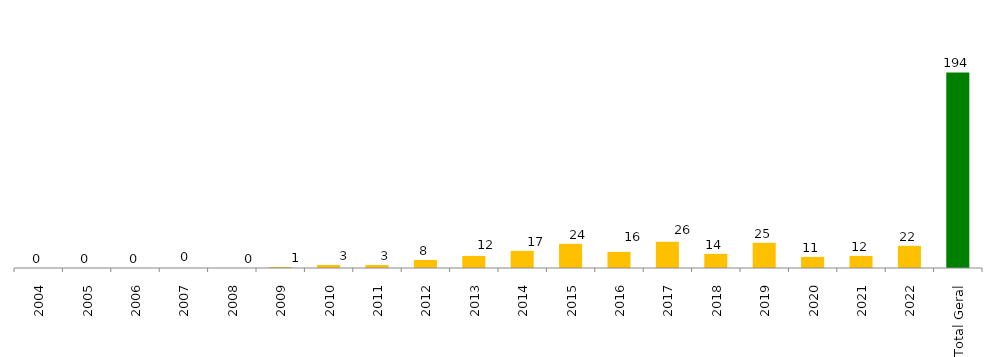
| Category | Categoria/Ano |
|---|---|
| 2004 | 0 |
| 2005 | 0 |
| 2006 | 0 |
| 2007 | 0 |
| 2008 | 0 |
| 2009 | 1 |
| 2010 | 3 |
| 2011 | 3 |
| 2012 | 8 |
| 2013 | 12 |
| 2014 | 17 |
| 2015 | 24 |
| 2016 | 16 |
| 2017 | 26 |
| 2018 | 14 |
| 2019 | 25 |
| 2020 | 11 |
| 2021 | 12 |
| 2022 | 22 |
| Total Geral | 194 |